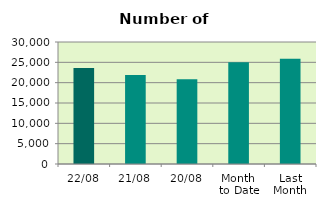
| Category | Series 0 |
|---|---|
| 22/08 | 23620 |
| 21/08 | 21888 |
| 20/08 | 20852 |
| Month 
to Date | 25046.375 |
| Last
Month | 25883.727 |